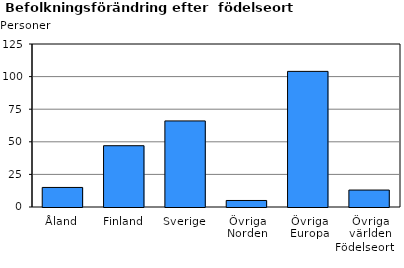
| Category | Series 0 |
|---|---|
| Åland | 15 |
| Finland | 47 |
| Sverige | 66 |
| Övriga Norden | 5 |
| Övriga Europa | 104 |
| Övriga världen | 13 |